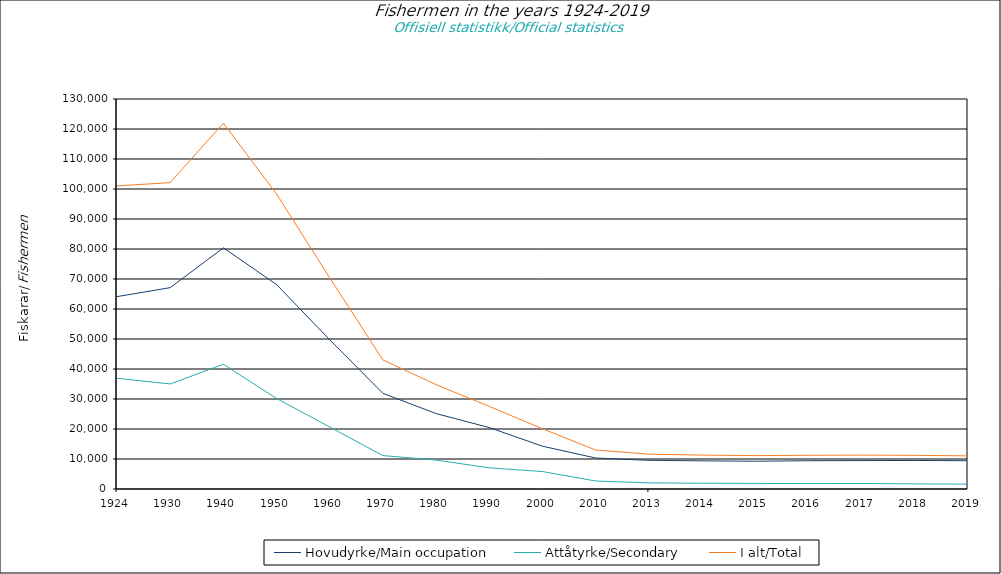
| Category | Hovudyrke/Main occupation | Attåtyrke/Secondary  | I alt/Total |
|---|---|---|---|
| 1924.0 | 64128 | 36911 | 101039 |
| 1930.0 | 67114 | 35009 | 102123 |
| 1940.0 | 80387 | 41574 | 121961 |
| 1950.0 | 68149 | 30175 | 98324 |
| 1960.0 | 49720 | 20655 | 70375 |
| 1970.0 | 31884 | 11134 | 43018 |
| 1980.0 | 25140 | 9649 | 34789 |
| 1990.0 | 20475 | 7043 | 27518 |
| 2000.0 | 14264 | 5811 | 20075 |
| 2010.0 | 10325 | 2668 | 12993 |
| 2013.0 | 9559 | 2052 | 11611 |
| 2014.0 | 9386 | 1915 | 11301 |
| 2015.0 | 9259 | 1871 | 11130 |
| 2016.0 | 9426 | 1810 | 11236 |
| 2017.0 | 9473 | 1834 | 11307 |
| 2018.0 | 9514 | 1705 | 11219 |
| 2019.0 | 9431 | 1617 | 11048 |